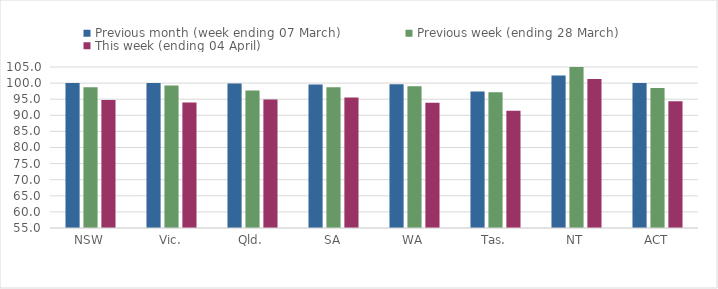
| Category | Previous month (week ending 07 March) | Previous week (ending 28 March) | This week (ending 04 April) |
|---|---|---|---|
| NSW | 100.06 | 98.748 | 94.729 |
| Vic. | 100.054 | 99.237 | 93.988 |
| Qld. | 99.877 | 97.703 | 94.878 |
| SA | 99.599 | 98.682 | 95.504 |
| WA | 99.655 | 99.007 | 93.915 |
| Tas. | 97.356 | 97.134 | 91.401 |
| NT | 102.37 | 105.845 | 101.264 |
| ACT | 100 | 98.475 | 94.376 |